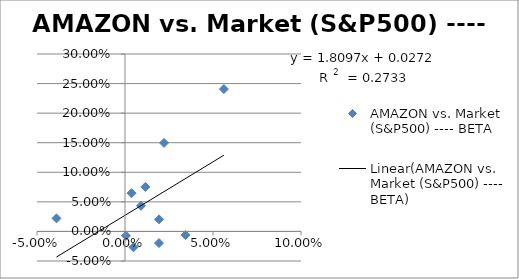
| Category | AMAZON vs. Market (S&P500) ---- BETA |
|---|---|
| 0.009091208549318209 | 0.043 |
| 0.011576251391341417 | 0.075 |
| 0.004813775090855441 | -0.027 |
| 0.019348826118030613 | 0.02 |
| 0.0005464328110856814 | -0.007 |
| 0.019302978533243684 | -0.02 |
| 0.02218813533034958 | 0.15 |
| 0.003720043010336637 | 0.065 |
| 0.034342557364422946 | -0.006 |
| 0.05617870444413305 | 0.241 |
| -0.03894737206189687 | 0.022 |